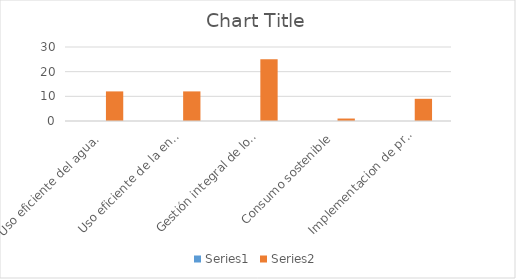
| Category | Series 0 | Series 1 |
|---|---|---|
| Uso eficiente del agua. |  | 12 |
| Uso eficiente de la energía |  | 12 |
| Gestión integral de los resiudos |  | 25 |
| Consumo sostenible |  | 1 |
| Implementacion de practicas sostenibles |  | 9 |